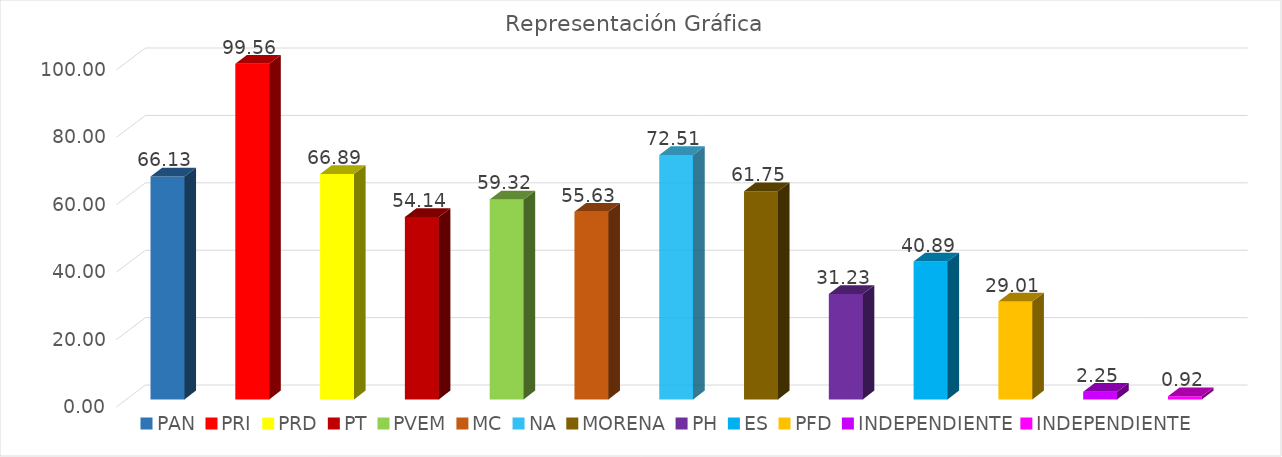
| Category | Series 0 |
|---|---|
| PAN | 66.133 |
| PRI | 99.56 |
| PRD | 66.893 |
| PT | 54.14 |
| PVEM | 59.32 |
| MC | 55.633 |
| NA | 72.513 |
| MORENA | 61.747 |
| PH | 31.233 |
| ES | 40.893 |
| PFD | 29.007 |
| INDEPENDIENTE | 2.25 |
| INDEPENDIENTE | 0.917 |